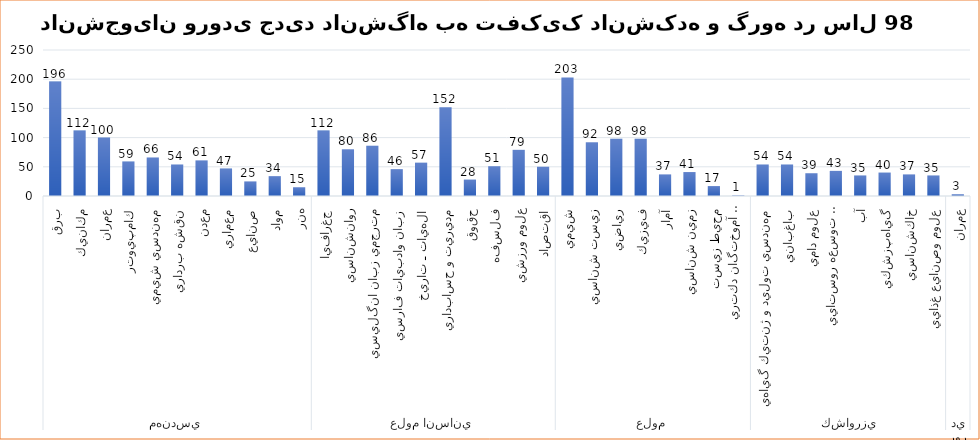
| Category | جمع |
|---|---|
| 0 | 196 |
| 1 | 112 |
| 2 | 100 |
| 3 | 59 |
| 4 | 66 |
| 5 | 54 |
| 6 | 61 |
| 7 | 47 |
| 8 | 25 |
| 9 | 34 |
| 10 | 15 |
| 11 | 112 |
| 12 | 80 |
| 13 | 86 |
| 14 | 46 |
| 15 | 57 |
| 16 | 152 |
| 17 | 28 |
| 18 | 51 |
| 19 | 79 |
| 20 | 50 |
| 21 | 203 |
| 22 | 92 |
| 23 | 98 |
| 24 | 98 |
| 25 | 37 |
| 26 | 41 |
| 27 | 17 |
| 28 | 1 |
| 29 | 54 |
| 30 | 54 |
| 31 | 39 |
| 32 | 43 |
| 33 | 35 |
| 34 | 40 |
| 35 | 37 |
| 36 | 35 |
| 37 | 3 |